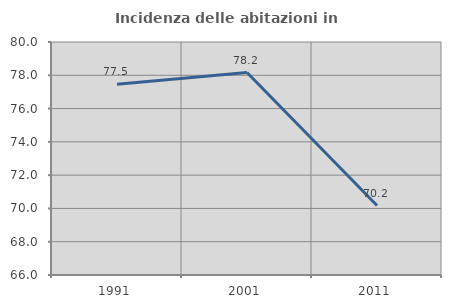
| Category | Incidenza delle abitazioni in proprietà  |
|---|---|
| 1991.0 | 77.457 |
| 2001.0 | 78.166 |
| 2011.0 | 70.174 |